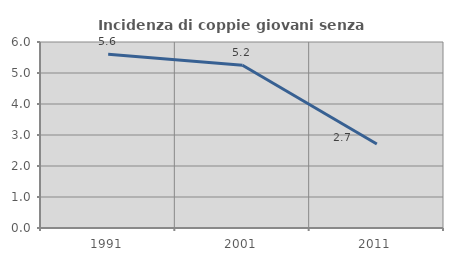
| Category | Incidenza di coppie giovani senza figli |
|---|---|
| 1991.0 | 5.607 |
| 2001.0 | 5.249 |
| 2011.0 | 2.707 |